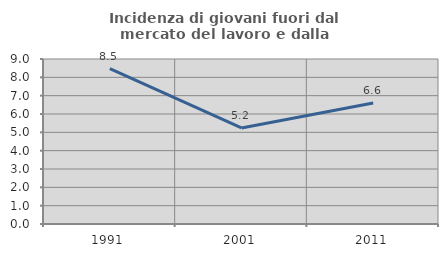
| Category | Incidenza di giovani fuori dal mercato del lavoro e dalla formazione  |
|---|---|
| 1991.0 | 8.479 |
| 2001.0 | 5.239 |
| 2011.0 | 6.595 |